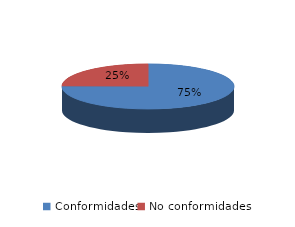
| Category | Series 0 |
|---|---|
| Conformidades | 518 |
| No conformidades | 171 |